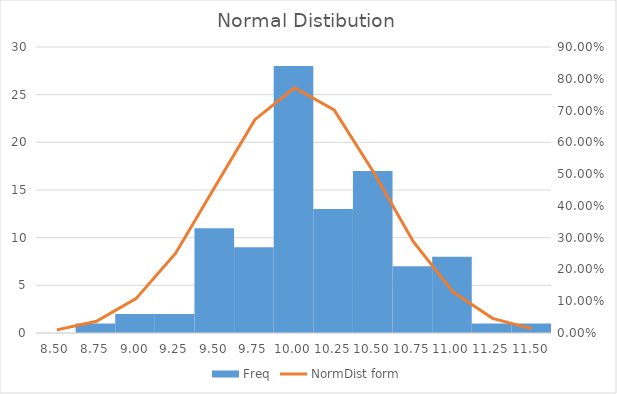
| Category | Freq |
|---|---|
| 8.5 | 0 |
| 8.75 | 1 |
| 9.0 | 2 |
| 9.25 | 2 |
| 9.5 | 11 |
| 9.75 | 9 |
| 10.0 | 28 |
| 10.25 | 13 |
| 10.5 | 17 |
| 10.75 | 7 |
| 11.0 | 8 |
| 11.25 | 1 |
| 11.5 | 1 |